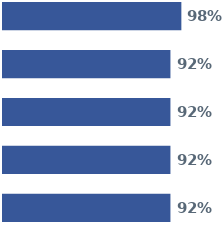
| Category | Series 0 | Series 1 | Series 2 | Series 3 | Series 4 |
|---|---|---|---|---|---|
| 0 | 0.98 | 0.92 | 0.92 | 0.92 | 0.92 |